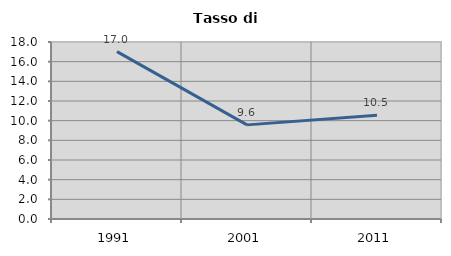
| Category | Tasso di disoccupazione   |
|---|---|
| 1991.0 | 17.026 |
| 2001.0 | 9.572 |
| 2011.0 | 10.545 |